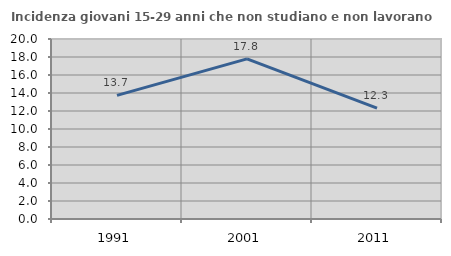
| Category | Incidenza giovani 15-29 anni che non studiano e non lavorano  |
|---|---|
| 1991.0 | 13.731 |
| 2001.0 | 17.797 |
| 2011.0 | 12.329 |